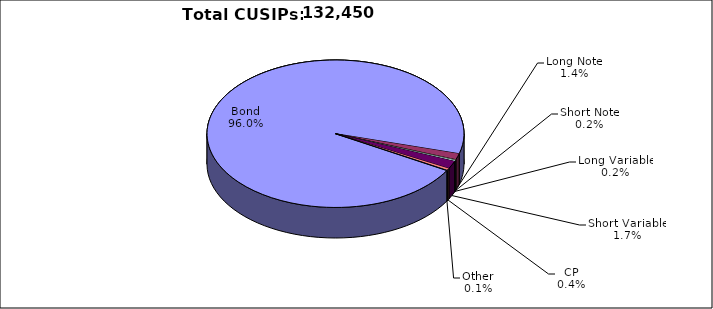
| Category | CUSIPs |
|---|---|
| Bond | 127200 |
| Long Note | 1789 |
| Short Note | 209 |
| Long Variable | 315 |
| Short Variable | 2262 |
| CP | 571 |
| Other | 104 |